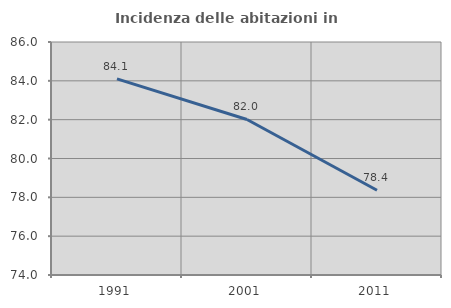
| Category | Incidenza delle abitazioni in proprietà  |
|---|---|
| 1991.0 | 84.102 |
| 2001.0 | 82.009 |
| 2011.0 | 78.367 |